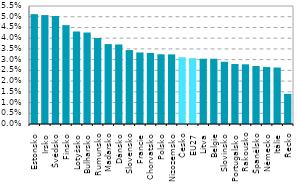
| Category | Series 0 |
|---|---|
| Estonsko | 0.051 |
| Irsko | 0.051 |
| Švédsko | 0.05 |
| Finsko | 0.046 |
| Lotyšsko | 0.043 |
| Bulharsko | 0.043 |
| Rumunsko | 0.04 |
| Maďarsko | 0.037 |
| Dánsko | 0.037 |
| Slovensko | 0.034 |
| Francie | 0.033 |
| Chorvatsko | 0.033 |
| Polsko | 0.032 |
| Nizozemsko | 0.032 |
| Česko | 0.031 |
| EU27 | 0.031 |
| Litva | 0.03 |
| Belgie | 0.03 |
| Slovinsko | 0.029 |
| Portugalsko | 0.028 |
| Rakousko | 0.028 |
| Španělsko | 0.027 |
| Německo | 0.027 |
| Itálie | 0.026 |
| Řecko | 0.014 |